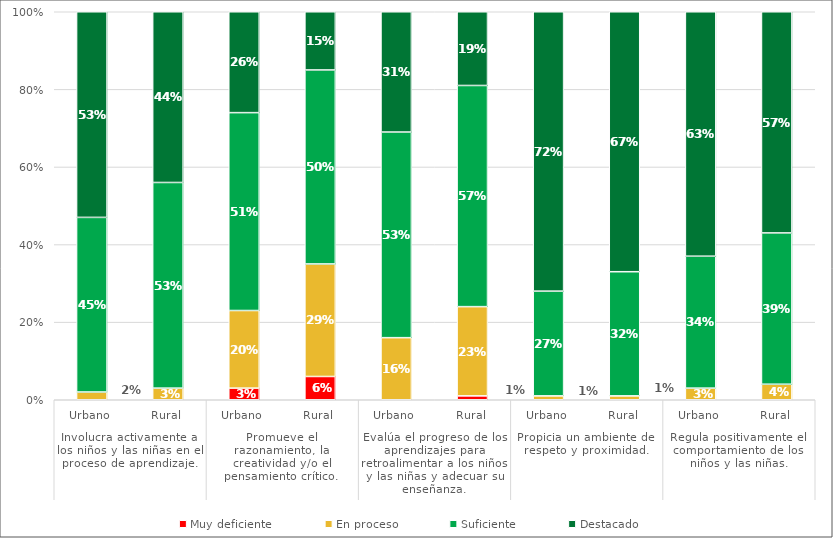
| Category | Muy deficiente | En proceso | Suficiente | Destacado |
|---|---|---|---|---|
| 0 | 0 | 0.02 | 0.45 | 0.53 |
| 1 | 0 | 0.03 | 0.53 | 0.44 |
| 2 | 0.03 | 0.2 | 0.51 | 0.26 |
| 3 | 0.06 | 0.29 | 0.5 | 0.15 |
| 4 | 0 | 0.16 | 0.53 | 0.31 |
| 5 | 0.01 | 0.23 | 0.57 | 0.19 |
| 6 | 0 | 0.01 | 0.27 | 0.72 |
| 7 | 0 | 0.01 | 0.32 | 0.67 |
| 8 | 0 | 0.03 | 0.34 | 0.63 |
| 9 | 0 | 0.04 | 0.39 | 0.57 |